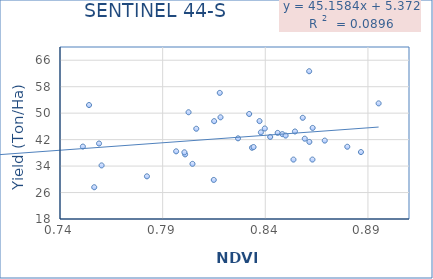
| Category | Series 0 |
|---|---|
| 0.837851 | 44.193 |
| 0.858242 | 48.59 |
| 0.83975 | 45.357 |
| 0.854447 | 44.457 |
| 0.751146 | 39.897 |
| 0.815086 | 47.577 |
| 0.79657 | 38.457 |
| 0.833525 | 39.537 |
| 0.863068 | 45.533 |
| 0.756673 | 27.6 |
| 0.759015 | 40.82 |
| 0.837186 | 47.593 |
| 0.846027 | 44.033 |
| 0.782346 | 30.9 |
| 0.853723 | 36.813 |
| 0.848313 | 35.96 |
| 0.849908 | 43.65 |
| 0.842385 | 43.227 |
| 0.83215 | 42.803 |
| 0.886595 | 49.743 |
| 0.818181 | 38.233 |
| 0.861467 | 48.74 |
| 0.806376 | 41.3 |
| 0.760254 | 45.283 |
| 0.800942 | 34.2 |
| 0.814901 | 40.053 |
| 0.804528 | 37.533 |
| 0.802619 | 29.81 |
| 0.800593 | 34.667 |
| 0.861375 | 50.267 |
| 0.826725 | 38.16 |
| 0.834287 | 39.84 |
| 0.862968 | 62.667 |
| 0.817821 | 42.387 |
| 0.859226 | 39.747 |
| 0.75414 | 35.967 |
| 0.8952 | 56.123 |
| 0.868961 | 42.28 |
| 0.863528 | 52.45 |
| 0.896477 | 52.953 |
| 0.846243 | 41.7 |